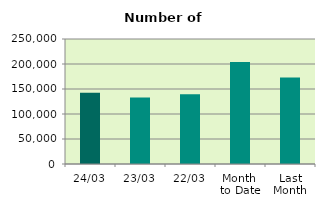
| Category | Series 0 |
|---|---|
| 24/03 | 142346 |
| 23/03 | 132882 |
| 22/03 | 139736 |
| Month 
to Date | 204014 |
| Last
Month | 173197.3 |